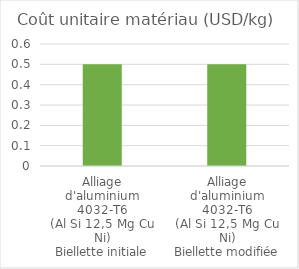
| Category | Alliage
d'aluminium
4032-T6
(Al Si 12,5 Mg Cu Ni)
Biellette initiale |
|---|---|
| Alliage
d'aluminium
4032-T6
(Al Si 12,5 Mg Cu Ni)
Biellette initiale | 0.5 |
| Alliage
d'aluminium
4032-T6
(Al Si 12,5 Mg Cu Ni)
Biellette modifiée | 0.5 |